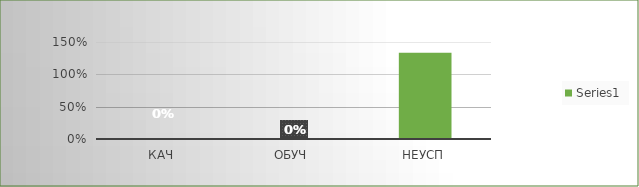
| Category | Series 0 |
|---|---|
| кач | 0 |
| обуч | 0 |
| неусп | 1.333 |